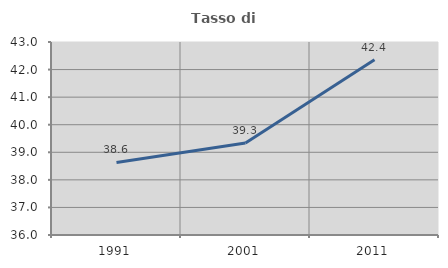
| Category | Tasso di occupazione   |
|---|---|
| 1991.0 | 38.63 |
| 2001.0 | 39.336 |
| 2011.0 | 42.36 |